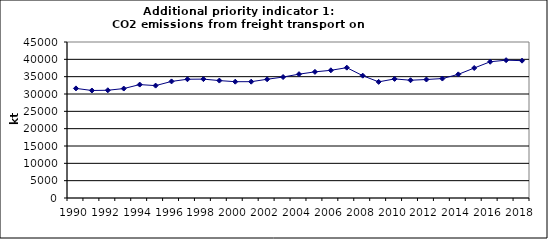
| Category | CO2 emissions from freight transport on road, kt  |
|---|---|
| 1990 | 31613.622 |
| 1991 | 31013.518 |
| 1992 | 31081.172 |
| 1993 | 31569.578 |
| 1994 | 32717.336 |
| 1995 | 32417.959 |
| 1996 | 33629.124 |
| 1997 | 34256.989 |
| 1998 | 34291.888 |
| 1999 | 33867.87 |
| 2000 | 33547.429 |
| 2001 | 33554.067 |
| 2002 | 34250.046 |
| 2003 | 34894.588 |
| 2004 | 35720.094 |
| 2005 | 36383.281 |
| 2006 | 36832.97 |
| 2007 | 37596.569 |
| 2008 | 35285.191 |
| 2009 | 33500.109 |
| 2010 | 34353.099 |
| 2011 | 33970.735 |
| 2012 | 34182.205 |
| 2013 | 34453.16 |
| 2014 | 35661.5 |
| 2015 | 37497.332 |
| 2016 | 39299.172 |
| 2017 | 39754.255 |
| 2018 | 39617.842 |